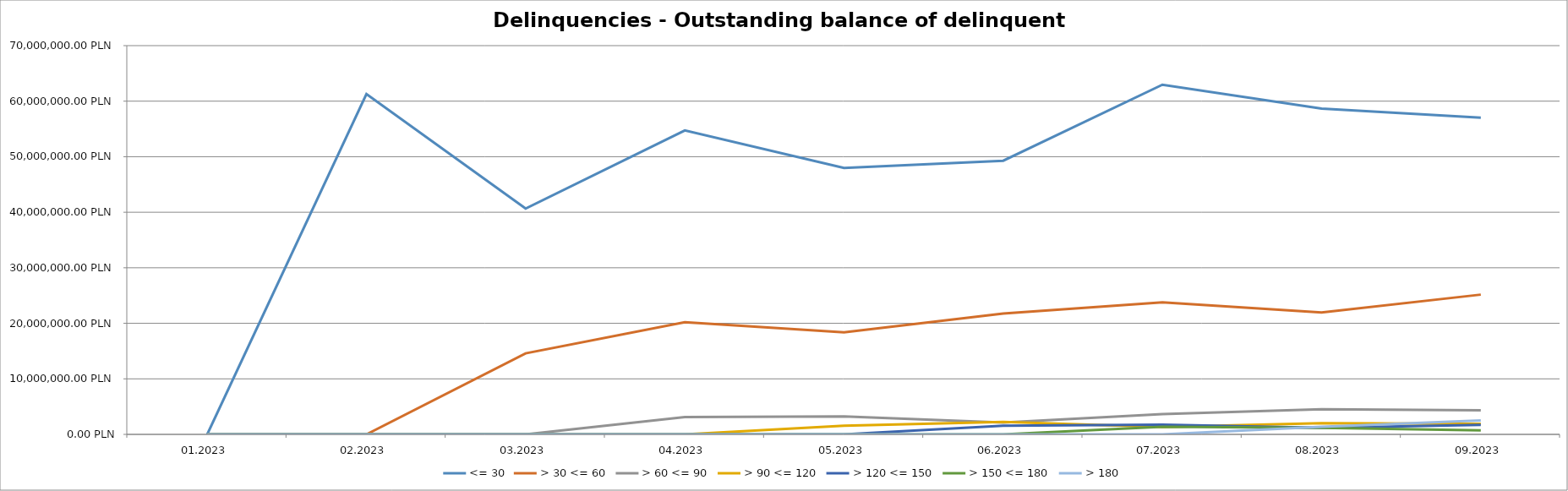
| Category | <= 30 | > 30 <= 60 | > 60 <= 90 | > 90 <= 120 | > 120 <= 150 | > 150 <= 180 | > 180 |
|---|---|---|---|---|---|---|---|
| 01.2023 | 0 | 0 | 0 | 0 | 0 | 0 | 0 |
| 02.2023 | 61279332.52 | 0 | 0 | 0 | 0 | 0 | 0 |
| 03.2023 | 40663789.15 | 14592814.21 | 0 | 0 | 0 | 0 | 0 |
| 04.2023 | 54729258.98 | 20207986.71 | 3105470.81 | 0 | 0 | 0 | 0 |
| 05.2023 | 47980491.52 | 18365026.23 | 3236930.39 | 1575049.71 | 0 | 0 | 0 |
| 06.2023 | 49274463.43 | 21757116.33 | 2145346.9 | 2234258.08 | 1546159.58 | 0 | 0 |
| 07.2023 | 62971390.96 | 23765504.45 | 3638339.96 | 1315739.52 | 1741228.92 | 1367122.32 | 0 |
| 08.2023 | 58667444.31 | 21958530.42 | 4534282.61 | 1998402.31 | 1197894.69 | 1186456.03 | 1367122.32 |
| 09.2023 | 57013090.09 | 25164417.49 | 4339269.75 | 1883194.82 | 1723494.5 | 705526.9 | 2508053.04 |